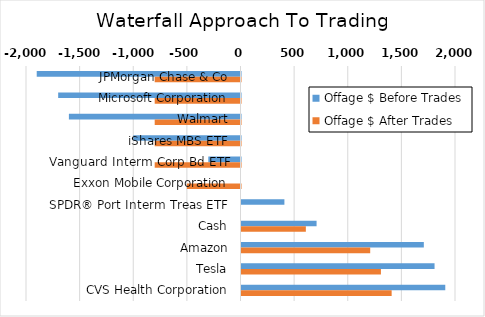
| Category | Offage $ Before Trades | Offage $ After Trades |
|---|---|---|
| JPMorgan Chase & Co | -1900 | -800 |
| Microsoft Corporation | -1700 | -800 |
| Walmart | -1600 | -800 |
| iShares MBS ETF | -1000 | -800 |
| Vanguard Interm Corp Bd ETF | -300 | -800 |
| Exxon Mobile Corporation | 0 | -500 |
| SPDR® Port Interm Treas ETF | 400 | 0 |
| Cash | 700 | 600 |
| Amazon | 1700 | 1200 |
| Tesla | 1800 | 1300 |
| CVS Health Corporation | 1900 | 1400 |